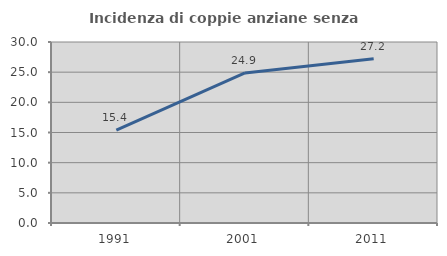
| Category | Incidenza di coppie anziane senza figli  |
|---|---|
| 1991.0 | 15.385 |
| 2001.0 | 24.878 |
| 2011.0 | 27.211 |